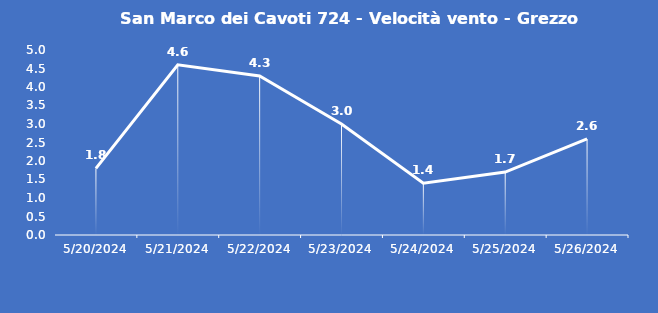
| Category | San Marco dei Cavoti 724 - Velocità vento - Grezzo (m/s) |
|---|---|
| 5/20/24 | 1.8 |
| 5/21/24 | 4.6 |
| 5/22/24 | 4.3 |
| 5/23/24 | 3 |
| 5/24/24 | 1.4 |
| 5/25/24 | 1.7 |
| 5/26/24 | 2.6 |